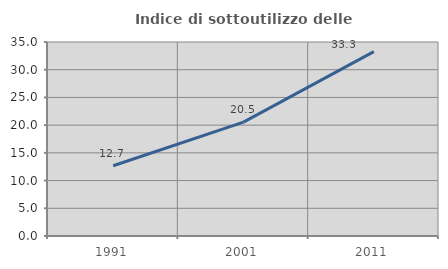
| Category | Indice di sottoutilizzo delle abitazioni  |
|---|---|
| 1991.0 | 12.674 |
| 2001.0 | 20.532 |
| 2011.0 | 33.266 |